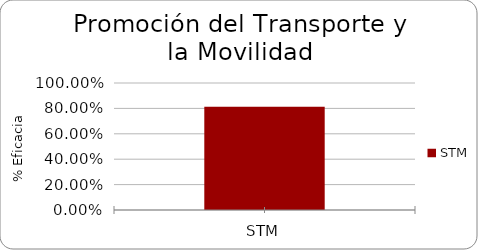
| Category | % Eficacia total |
|---|---|
| STM | 0.812 |